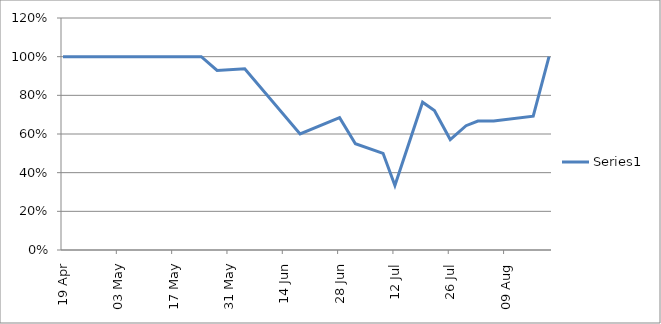
| Category | Series 0 |
|---|---|
| 2011-04-19 11:00:00 | 1 |
| 2011-04-22 08:40:00 | 1 |
| 2011-05-14 05:25:00 | 1 |
| 2011-05-22 06:40:00 | 1 |
| 2011-05-24 06:50:00 | 1 |
| 2011-05-28 09:00:00 | 0.929 |
| 2011-06-04 10:00:00 | 0.938 |
| 2011-06-18 12:05:00 | 0.6 |
| 2011-06-28 12:15:00 | 0.684 |
| 2011-07-02 10:15:00 | 0.55 |
| 2011-07-09 10:15:00 | 0.5 |
| 2011-07-12 19:50:00 | 0.333 |
| 2011-07-19 12:10:00 | 0.765 |
| 2011-07-22 19:20:00 | 0.721 |
| 2011-07-26 09:30:00 | 0.571 |
| 2011-07-30 11:30:00 | 0.643 |
| 2011-08-02 12:15:00 | 0.667 |
| 2011-08-06 09:35:00 | 0.667 |
| 2011-08-16 07:05:00 | 0.692 |
| 2011-08-20 09:10:00 | 1 |